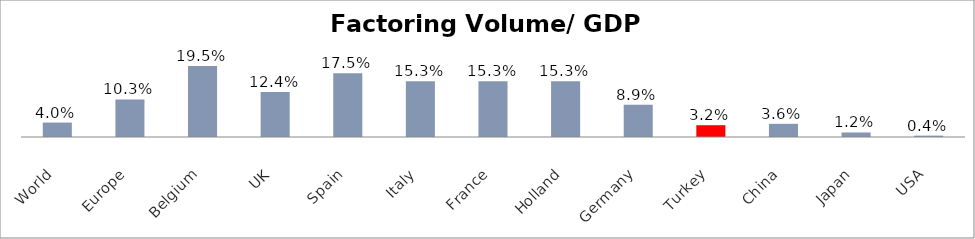
| Category | Factoring Volume/ GDP (%) |
|---|---|
| World | 0.04 |
| Europe | 0.103 |
| Belgium | 0.195 |
| UK | 0.124 |
| Spain | 0.175 |
| Italy | 0.153 |
| France | 0.153 |
| Holland | 0.153 |
| Germany | 0.089 |
| Turkey | 0.032 |
| China | 0.036 |
| Japan | 0.012 |
| USA | 0.004 |